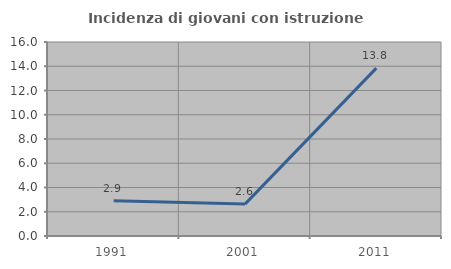
| Category | Incidenza di giovani con istruzione universitaria |
|---|---|
| 1991.0 | 2.899 |
| 2001.0 | 2.632 |
| 2011.0 | 13.846 |